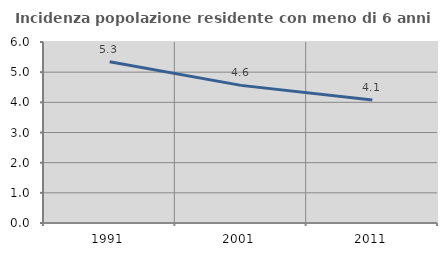
| Category | Incidenza popolazione residente con meno di 6 anni |
|---|---|
| 1991.0 | 5.347 |
| 2001.0 | 4.562 |
| 2011.0 | 4.076 |